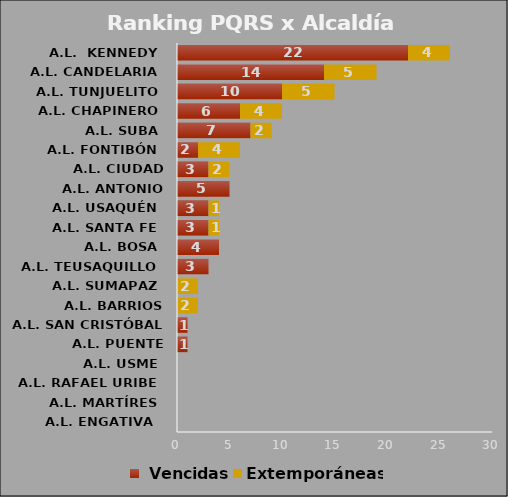
| Category |  Vencidas | Extemporáneas |
|---|---|---|
| A.L. ENGATIVA  | 0 | 0 |
| A.L. MARTÍRES | 0 | 0 |
| A.L. RAFAEL URIBE | 0 | 0 |
| A.L. USME | 0 | 0 |
| A.L. PUENTE ARANDA | 1 | 0 |
| A.L. SAN CRISTÓBAL | 1 | 0 |
| A.L. BARRIOS UNIDOS | 0 | 2 |
| A.L. SUMAPAZ | 0 | 2 |
| A.L. TEUSAQUILLO | 3 | 0 |
| A.L. BOSA | 4 | 0 |
| A.L. SANTA FE | 3 | 1 |
| A.L. USAQUÉN | 3 | 1 |
| A.L. ANTONIO NARINO | 5 | 0 |
| A.L. CIUDAD BOLÍVAR | 3 | 2 |
| A.L. FONTIBÓN | 2 | 4 |
| A.L. SUBA | 7 | 2 |
| A.L. CHAPINERO | 6 | 4 |
| A.L. TUNJUELITO | 10 | 5 |
| A.L. CANDELARIA | 14 | 5 |
| A.L.  KENNEDY | 22 | 4 |